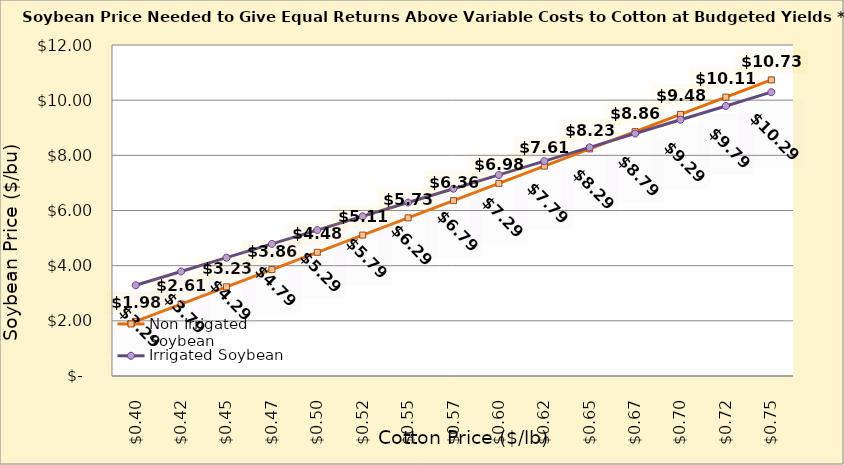
| Category | Non Irrigated Soybean | Irrigated Soybean |
|---|---|---|
| 0.3949999999999998 | 1.984 | 3.289 |
| 0.4199999999999998 | 2.609 | 3.789 |
| 0.44499999999999984 | 3.234 | 4.289 |
| 0.46999999999999986 | 3.859 | 4.789 |
| 0.4949999999999999 | 4.484 | 5.289 |
| 0.5199999999999999 | 5.109 | 5.789 |
| 0.5449999999999999 | 5.734 | 6.289 |
| 0.57 | 6.359 | 6.789 |
| 0.595 | 6.984 | 7.289 |
| 0.62 | 7.609 | 7.789 |
| 0.645 | 8.234 | 8.289 |
| 0.67 | 8.859 | 8.789 |
| 0.6950000000000001 | 9.484 | 9.289 |
| 0.7200000000000001 | 10.109 | 9.789 |
| 0.7450000000000001 | 10.734 | 10.289 |